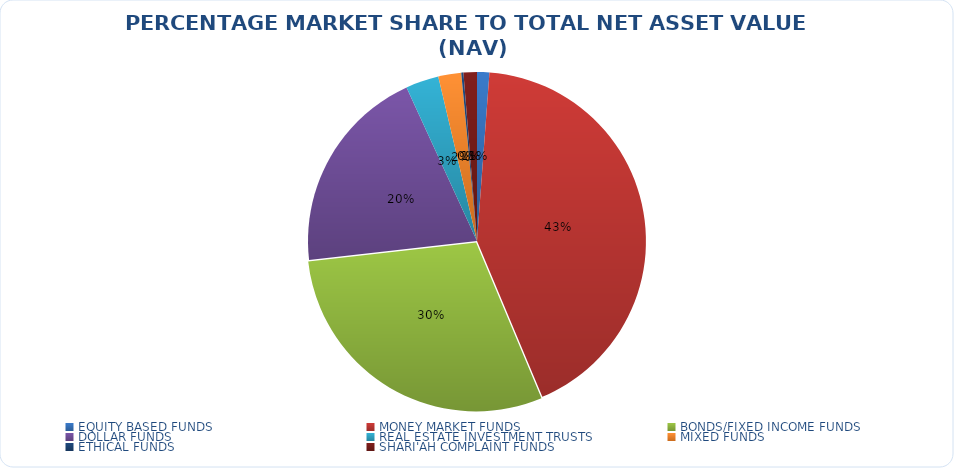
| Category | NET ASSET VALUE |
|---|---|
| EQUITY BASED FUNDS | 16870776072.37 |
| MONEY MARKET FUNDS | 609635917973.14 |
| BONDS/FIXED INCOME FUNDS | 423417886681.37 |
| DOLLAR FUNDS | 286153462616.571 |
| REAL ESTATE INVESTMENT TRUSTS | 45371843202.31 |
| MIXED FUNDS | 31454079522.75 |
| ETHICAL FUNDS | 2964742276.34 |
| SHARI'AH COMPLAINT FUNDS | 18383653215.22 |